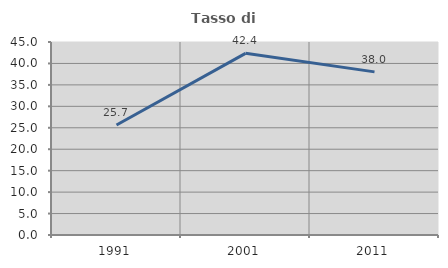
| Category | Tasso di occupazione   |
|---|---|
| 1991.0 | 25.652 |
| 2001.0 | 42.355 |
| 2011.0 | 38.033 |